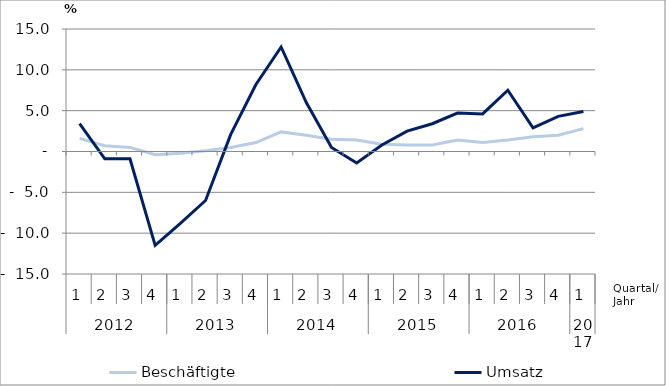
| Category | Beschäftigte | Umsatz |
|---|---|---|
| 0 | 1.6 | 3.4 |
| 1 | 0.7 | -0.9 |
| 2 | 0.5 | -0.9 |
| 3 | -0.4 | -11.5 |
| 4 | -0.2 | -8.8 |
| 5 | 0.1 | -6 |
| 6 | 0.5 | 2.1 |
| 7 | 1.1 | 8.2 |
| 8 | 2.4 | 12.8 |
| 9 | 2 | 6 |
| 10 | 1.5 | 0.5 |
| 11 | 1.4 | -1.4 |
| 12 | 0.9 | 0.8 |
| 13 | 0.8 | 2.5 |
| 14 | 0.8 | 3.4 |
| 15 | 1.4 | 4.7 |
| 16 | 1.1 | 4.6 |
| 17 | 1.4 | 7.5 |
| 18 | 1.8 | 2.9 |
| 19 | 2 | 4.3 |
| 20 | 2.8 | 4.9 |